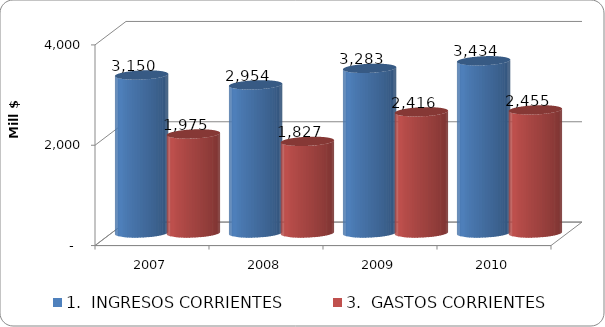
| Category | 1.  INGRESOS CORRIENTES | 3.  GASTOS CORRIENTES |
|---|---|---|
| 2007 | 3150.173 | 1974.752 |
| 2008 | 2953.814 | 1827.39 |
| 2009 | 3283.184 | 2415.908 |
| 2010 | 3433.663 | 2454.666 |